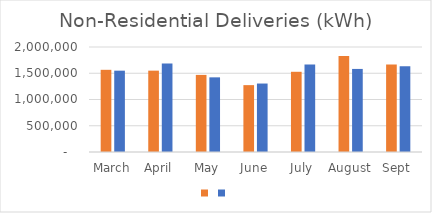
| Category | Series 1 | Series 0 |
|---|---|---|
| March | 1565360 | 1549153 |
| April | 1549578 | 1684688 |
| May | 1468470 | 1421957 |
| June | 1273660 | 1304116 |
| July | 1527956 | 1664865 |
| August | 1829758 | 1582276 |
| Sept | 1665239 | 1633351 |